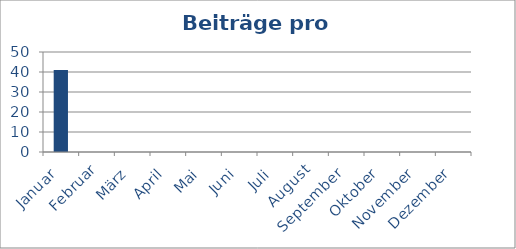
| Category | Beiträge |
|---|---|
| Januar | 41 |
| Februar | 0 |
| März | 0 |
| April | 0 |
| Mai | 0 |
| Juni | 0 |
| Juli | 0 |
| August | 0 |
| September | 0 |
| Oktober | 0 |
| November | 0 |
| Dezember | 0 |